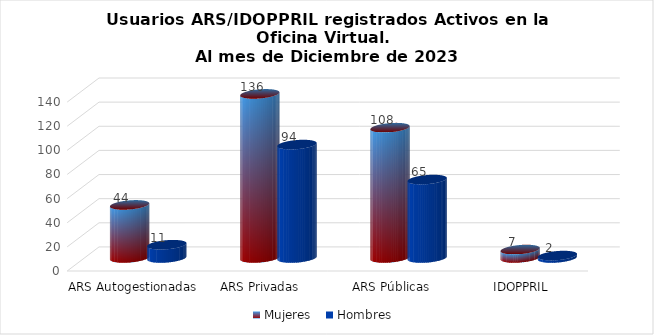
| Category | Mujeres | Hombres |
|---|---|---|
| ARS Autogestionadas | 44 | 11 |
| ARS Privadas | 136 | 94 |
| ARS Públicas | 108 | 65 |
| IDOPPRIL | 7 | 2 |